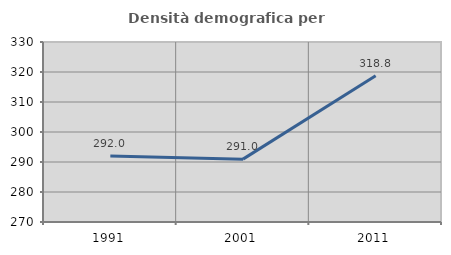
| Category | Densità demografica |
|---|---|
| 1991.0 | 292.023 |
| 2001.0 | 290.954 |
| 2011.0 | 318.765 |